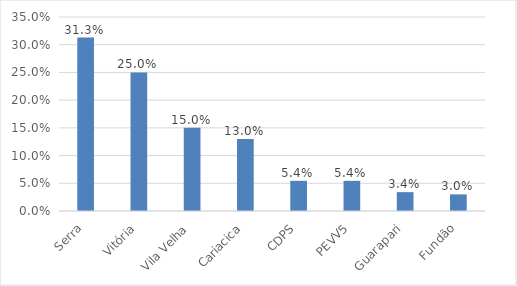
| Category | Series 0 |
|---|---|
| Serra | 0.313 |
| Vitória | 0.25 |
| Vila Velha | 0.15 |
| Cariacica | 0.13 |
| CDPS | 0.054 |
| PEVV5 | 0.054 |
| Guarapari | 0.034 |
| Fundão | 0.03 |